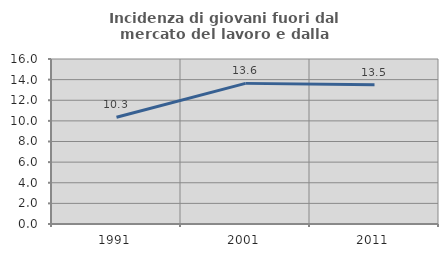
| Category | Incidenza di giovani fuori dal mercato del lavoro e dalla formazione  |
|---|---|
| 1991.0 | 10.345 |
| 2001.0 | 13.636 |
| 2011.0 | 13.514 |